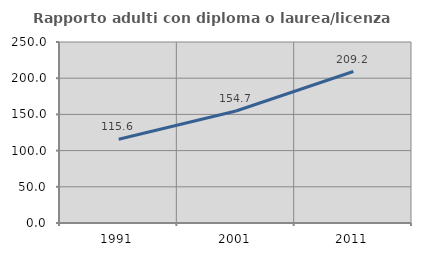
| Category | Rapporto adulti con diploma o laurea/licenza media  |
|---|---|
| 1991.0 | 115.635 |
| 2001.0 | 154.684 |
| 2011.0 | 209.243 |